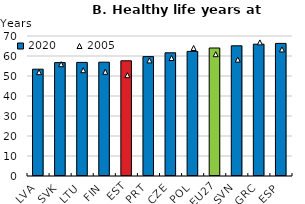
| Category | 2020 |
|---|---|
| LVA | 53.4 |
| SVK | 56.7 |
| LTU | 56.8 |
| FIN | 56.9 |
| EST | 57.6 |
| PRT | 59.7 |
| CZE | 61.6 |
| POL | 62.3 |
| EU27 | 64 |
| SVN | 65.1 |
| GRC | 65.9 |
| ESP | 66.3 |